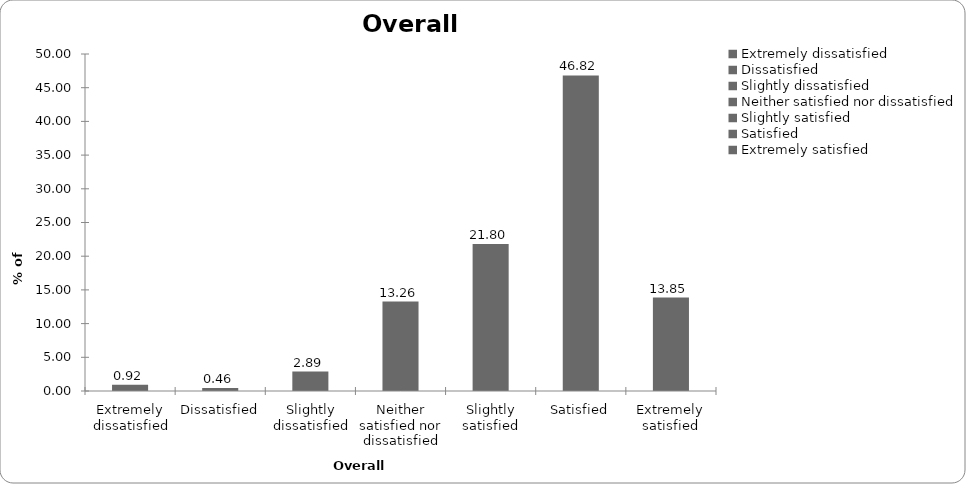
| Category | Overall satisfaction |
|---|---|
| Extremely dissatisfied | 0.919 |
| Dissatisfied | 0.46 |
| Slightly dissatisfied | 2.889 |
| Neither satisfied nor dissatisfied | 13.263 |
| Slightly satisfied | 21.799 |
| Satisfied | 46.815 |
| Extremely satisfied | 13.854 |